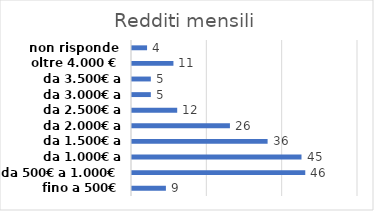
| Category | Redditi mensili |
|---|---|
| fino a 500€ | 9 |
| da 500€ a 1.000€ | 46 |
| da 1.000€ a 1.500€ | 45 |
| da 1.500€ a 2.000€ | 36 |
| da 2.000€ a 2.500€ | 26 |
| da 2.500€ a 3.000€ | 12 |
| da 3.000€ a 3.500€ | 5 |
| da 3.500€ a 4.000€ | 5 |
| oltre 4.000 € | 11 |
| non risponde | 4 |